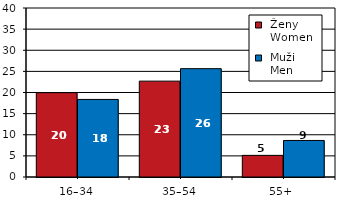
| Category |  Ženy 
 Women |  Muži 
 Men |
|---|---|---|
| 16–34 | 19.96 | 18.36 |
| 35–54 | 22.69 | 25.64 |
| 55+  | 5.12 | 8.65 |